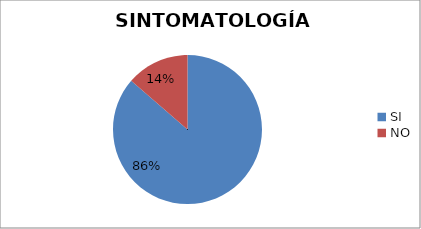
| Category | Series 0 |
|---|---|
| SI   | 19 |
| NO | 3 |